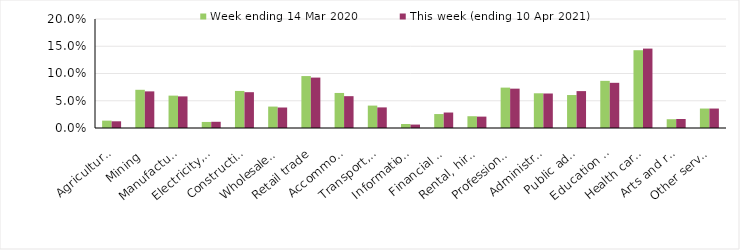
| Category | Week ending 14 Mar 2020 | This week (ending 10 Apr 2021) |
|---|---|---|
| Agriculture, forestry and fishing | 0.014 | 0.012 |
| Mining | 0.07 | 0.067 |
| Manufacturing | 0.059 | 0.058 |
| Electricity, gas, water and waste services | 0.011 | 0.011 |
| Construction | 0.068 | 0.066 |
| Wholesale trade | 0.039 | 0.038 |
| Retail trade | 0.095 | 0.092 |
| Accommodation and food services | 0.064 | 0.058 |
| Transport, postal and warehousing | 0.041 | 0.038 |
| Information media and telecommunications | 0.007 | 0.006 |
| Financial and insurance services | 0.026 | 0.028 |
| Rental, hiring and real estate services | 0.022 | 0.021 |
| Professional, scientific and technical services | 0.074 | 0.072 |
| Administrative and support services | 0.064 | 0.063 |
| Public administration and safety | 0.06 | 0.068 |
| Education and training | 0.086 | 0.083 |
| Health care and social assistance | 0.143 | 0.146 |
| Arts and recreation services | 0.016 | 0.016 |
| Other services | 0.036 | 0.036 |